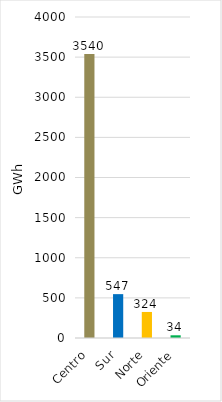
| Category | Series 0 |
|---|---|
| Centro | 3539.8 |
| Sur | 546.62 |
| Norte | 324.432 |
| Oriente | 33.7 |